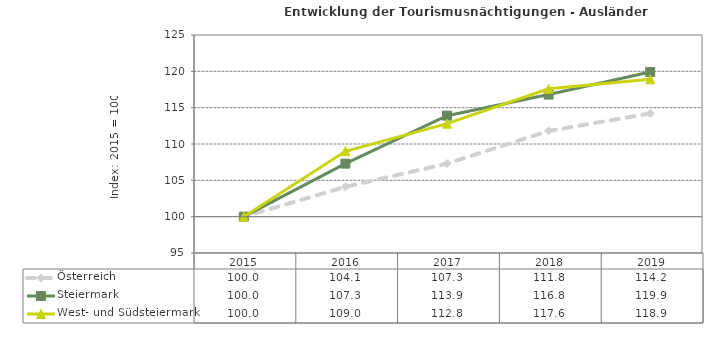
| Category | Österreich | Steiermark | West- und Südsteiermark |
|---|---|---|---|
| 2019.0 | 114.2 | 119.9 | 118.9 |
| 2018.0 | 111.8 | 116.8 | 117.6 |
| 2017.0 | 107.3 | 113.9 | 112.8 |
| 2016.0 | 104.1 | 107.3 | 109 |
| 2015.0 | 100 | 100 | 100 |